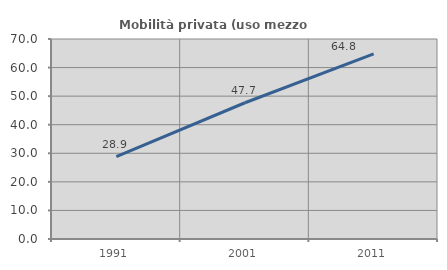
| Category | Mobilità privata (uso mezzo privato) |
|---|---|
| 1991.0 | 28.856 |
| 2001.0 | 47.69 |
| 2011.0 | 64.827 |